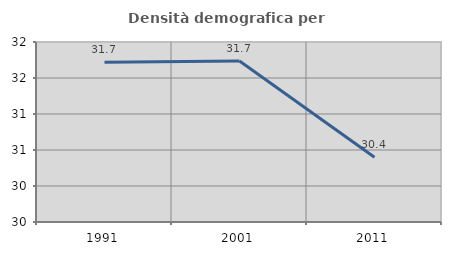
| Category | Densità demografica |
|---|---|
| 1991.0 | 31.718 |
| 2001.0 | 31.737 |
| 2011.0 | 30.401 |